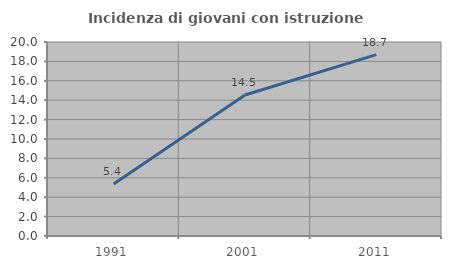
| Category | Incidenza di giovani con istruzione universitaria |
|---|---|
| 1991.0 | 5.372 |
| 2001.0 | 14.535 |
| 2011.0 | 18.699 |